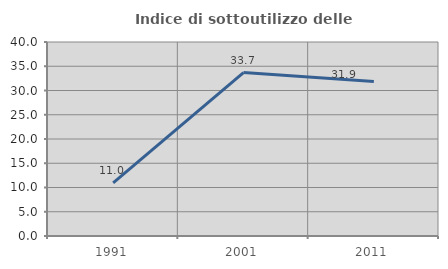
| Category | Indice di sottoutilizzo delle abitazioni  |
|---|---|
| 1991.0 | 10.959 |
| 2001.0 | 33.696 |
| 2011.0 | 31.868 |